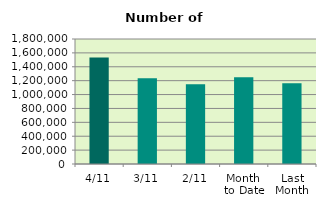
| Category | Series 0 |
|---|---|
| 4/11 | 1534982 |
| 3/11 | 1235128 |
| 2/11 | 1149194 |
| Month 
to Date | 1249421 |
| Last
Month | 1161301.714 |